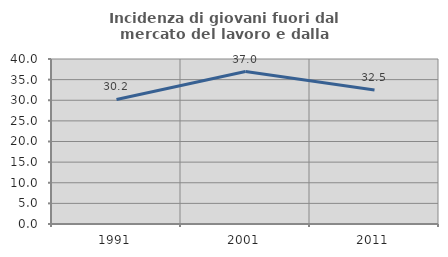
| Category | Incidenza di giovani fuori dal mercato del lavoro e dalla formazione  |
|---|---|
| 1991.0 | 30.182 |
| 2001.0 | 36.954 |
| 2011.0 | 32.501 |